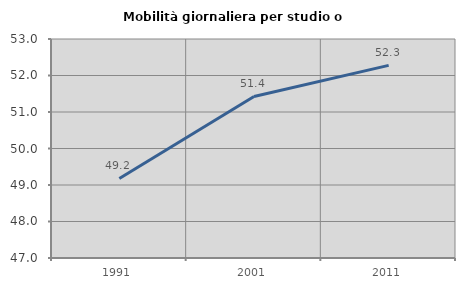
| Category | Mobilità giornaliera per studio o lavoro |
|---|---|
| 1991.0 | 49.179 |
| 2001.0 | 51.427 |
| 2011.0 | 52.277 |